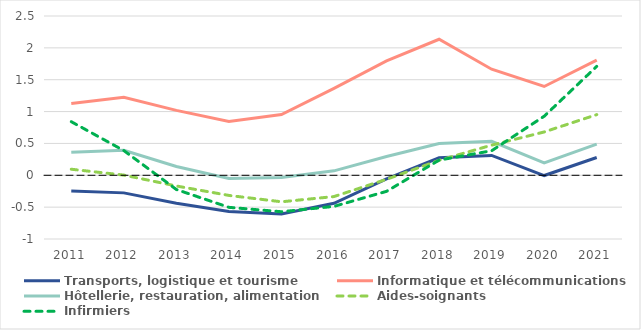
| Category | Transports, logistique et tourisme | Informatique et télécommunications | Hôtellerie, restauration, alimentation | Aides-soignants | Infirmiers |
|---|---|---|---|---|---|
| 2011.0 | -0.246 | 1.127 | 0.362 | 0.095 | 0.841 |
| 2012.0 | -0.276 | 1.225 | 0.392 | 0.003 | 0.388 |
| 2013.0 | -0.439 | 1.019 | 0.139 | -0.168 | -0.223 |
| 2014.0 | -0.568 | 0.846 | -0.049 | -0.316 | -0.503 |
| 2015.0 | -0.606 | 0.953 | -0.033 | -0.416 | -0.572 |
| 2016.0 | -0.44 | 1.365 | 0.07 | -0.334 | -0.488 |
| 2017.0 | -0.057 | 1.794 | 0.295 | -0.063 | -0.252 |
| 2018.0 | 0.274 | 2.135 | 0.498 | 0.235 | 0.238 |
| 2019.0 | 0.311 | 1.665 | 0.534 | 0.473 | 0.385 |
| 2020.0 | -0.004 | 1.394 | 0.193 | 0.68 | 0.927 |
| 2021.0 | 0.279 | 1.808 | 0.489 | 0.952 | 1.709 |